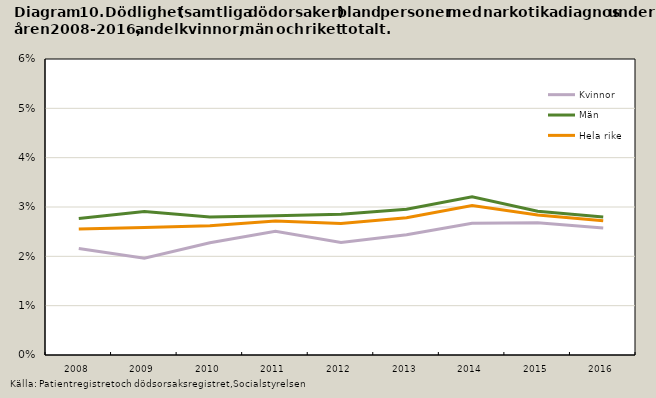
| Category | Kvinnor | Män | Hela riket |
|---|---|---|---|
| 2008.0 | 0.022 | 0.028 | 0.026 |
| 2009.0 | 0.02 | 0.029 | 0.026 |
| 2010.0 | 0.023 | 0.028 | 0.026 |
| 2011.0 | 0.025 | 0.028 | 0.027 |
| 2012.0 | 0.023 | 0.029 | 0.027 |
| 2013.0 | 0.024 | 0.03 | 0.028 |
| 2014.0 | 0.027 | 0.032 | 0.03 |
| 2015.0 | 0.027 | 0.029 | 0.028 |
| 2016.0 | 0.026 | 0.028 | 0.027 |